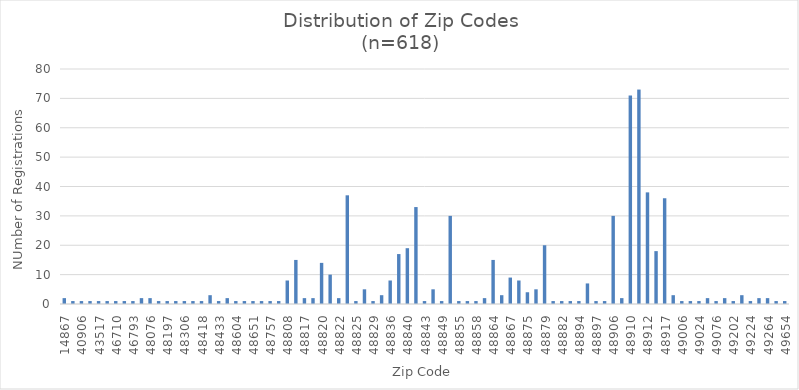
| Category | Series 0 |
|---|---|
| 14867.0 | 2 |
| 16240.0 | 1 |
| 40906.0 | 1 |
| 42912.0 | 1 |
| 43517.0 | 1 |
| 46038.0 | 1 |
| 46710.0 | 1 |
| 46732.0 | 1 |
| 46793.0 | 1 |
| 48033.0 | 2 |
| 48076.0 | 2 |
| 48137.0 | 1 |
| 48197.0 | 1 |
| 48202.0 | 1 |
| 48306.0 | 1 |
| 48393.0 | 1 |
| 48418.0 | 1 |
| 48430.0 | 3 |
| 48433.0 | 1 |
| 48449.0 | 2 |
| 48604.0 | 1 |
| 48614.0 | 1 |
| 48651.0 | 1 |
| 48708.0 | 1 |
| 48757.0 | 1 |
| 48805.0 | 1 |
| 48808.0 | 8 |
| 48813.0 | 15 |
| 48817.0 | 2 |
| 48819.0 | 2 |
| 48820.0 | 14 |
| 48821.0 | 10 |
| 48822.0 | 2 |
| 48823.0 | 37 |
| 48825.0 | 1 |
| 48827.0 | 5 |
| 48829.0 | 1 |
| 48831.0 | 3 |
| 48836.0 | 8 |
| 48837.0 | 17 |
| 48840.0 | 19 |
| 48842.0 | 33 |
| 48843.0 | 1 |
| 48848.0 | 5 |
| 48849.0 | 1 |
| 48854.0 | 30 |
| 48855.0 | 1 |
| 48857.0 | 1 |
| 48858.0 | 1 |
| 48861.0 | 2 |
| 48864.0 | 15 |
| 48866.0 | 3 |
| 48867.0 | 9 |
| 48872.0 | 8 |
| 48875.0 | 4 |
| 48876.0 | 5 |
| 48879.0 | 20 |
| 48880.0 | 1 |
| 48882.0 | 1 |
| 48892.0 | 1 |
| 48894.0 | 1 |
| 48895.0 | 7 |
| 48897.0 | 1 |
| 48901.0 | 1 |
| 48906.0 | 30 |
| 48909.0 | 2 |
| 48910.0 | 71 |
| 48911.0 | 73 |
| 48912.0 | 38 |
| 48915.0 | 18 |
| 48917.0 | 36 |
| 48933.0 | 3 |
| 49006.0 | 1 |
| 49008.0 | 1 |
| 49024.0 | 1 |
| 49028.0 | 2 |
| 49076.0 | 1 |
| 49201.0 | 2 |
| 49202.0 | 1 |
| 49203.0 | 3 |
| 49224.0 | 1 |
| 49251.0 | 2 |
| 49264.0 | 2 |
| 49285.0 | 1 |
| 49654.0 | 1 |